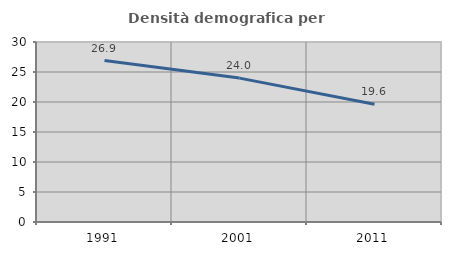
| Category | Densità demografica |
|---|---|
| 1991.0 | 26.9 |
| 2001.0 | 23.983 |
| 2011.0 | 19.622 |